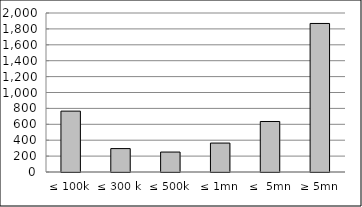
| Category | Series 0 |
|---|---|
| ≤ 100k | 765713592.35 |
| ≤ 300 k | 294471330.159 |
| ≤ 500k | 250922114.23 |
| ≤ 1mn | 363807311.58 |
| ≤  5mn | 635413060.266 |
| ≥ 5mn | 1868498936.2 |